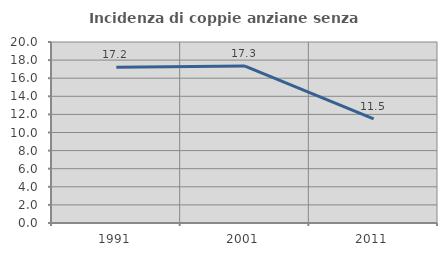
| Category | Incidenza di coppie anziane senza figli  |
|---|---|
| 1991.0 | 17.204 |
| 2001.0 | 17.341 |
| 2011.0 | 11.494 |